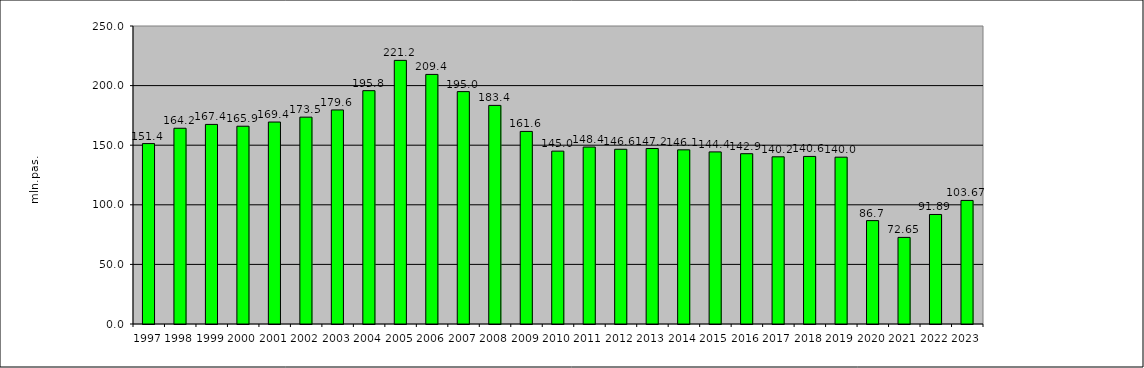
| Category | passengers transported (mill pas.) |
|---|---|
| 1997.0 | 151.353 |
| 1998.0 | 164.213 |
| 1999.0 | 167.439 |
| 2000.0 | 165.917 |
| 2001.0 | 169.429 |
| 2002.0 | 173.532 |
| 2003.0 | 179.572 |
| 2004.0 | 195.756 |
| 2005.0 | 221.168 |
| 2006.0 | 209.381 |
| 2007.0 | 194.955 |
| 2008.0 | 183.39 |
| 2009.0 | 161.559 |
| 2010.0 | 145.021 |
| 2011.0 | 148.448 |
| 2012.0 | 146.587 |
| 2013.0 | 147.216 |
| 2014.0 | 146.114 |
| 2015.0 | 144.374 |
| 2016.0 | 142.871 |
| 2017.0 | 140.249 |
| 2018.0 | 140.583 |
| 2019.0 | 139.955 |
| 2020.0 | 86.725 |
| 2021.0 | 72.65 |
| 2022.0 | 91.886 |
| 2023.0 | 103.671 |